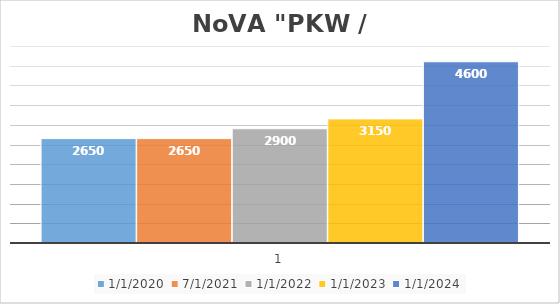
| Category | 01.01.2020 | 01.07.2021 | 01.01.2022 | 01.01.2023 | 01.01.2024 |
|---|---|---|---|---|---|
| 0 | 2650 | 2650 | 2900 | 3150 | 4600 |